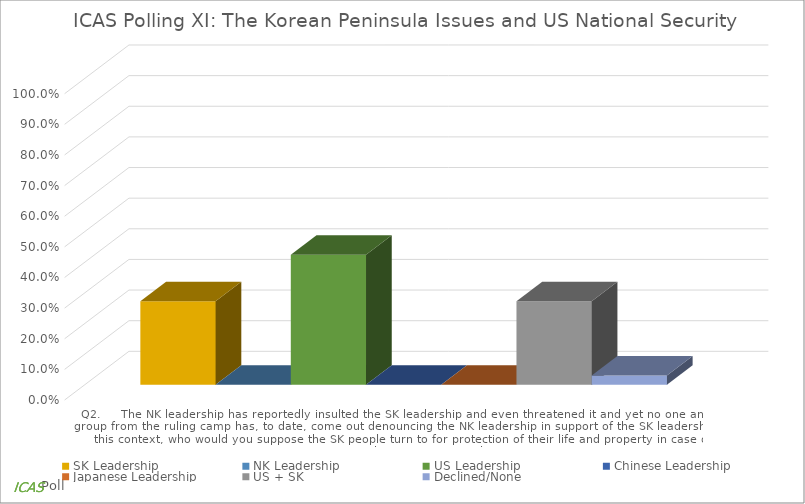
| Category | SK Leadership | NK Leadership | US Leadership | Chinese Leadership | Japanese Leadership | US + SK | Declined/None |
|---|---|---|---|---|---|---|---|
| Q2.     The NK leadership has reportedly insulted the SK leadership and even threatened it and yet no one and no group from the ruling camp has, to date, come out denouncing the NK leadership in support of the SK leadership. In this context, who would you  | 0.273 | 0 | 0.424 | 0 | 0 | 0.273 | 0.03 |